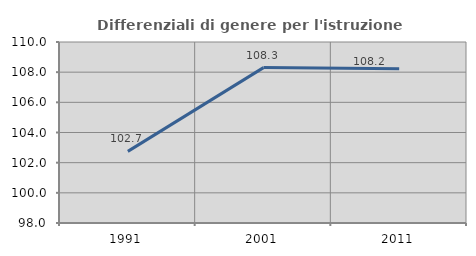
| Category | Differenziali di genere per l'istruzione superiore |
|---|---|
| 1991.0 | 102.748 |
| 2001.0 | 108.301 |
| 2011.0 | 108.222 |